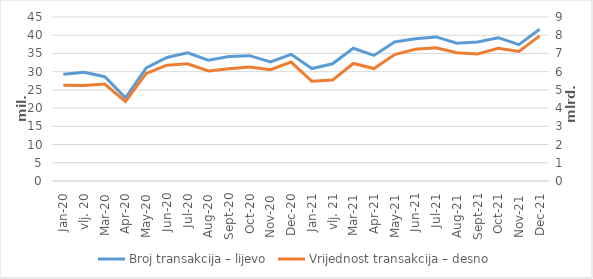
| Category | Broj transakcija – lijevo |
|---|---|
| sij.20 | 29304697 |
| vlj. 20 | 29831606 |
| ožu.20 | 28609157 |
| tra.20 | 22811373 |
| svi.20 | 31008472 |
| lip.20 | 33899579 |
| srp.20 | 35194797 |
| kol.20 | 33170654 |
| ruj.20 | 34132416 |
| lis.20 | 34392176 |
| stu.20 | 32703782 |
| pro.20 | 34752449 |
| sij.21 | 30857736 |
| vlj. 21 | 32165658 |
| ožu.21 | 36430661 |
| tra.21 | 34458263 |
| svi.21 | 38155959 |
| lip.21 | 39005206 |
| srp.21 | 39533016 |
| kol.21 | 37807123 |
| ruj.21 | 38169994 |
| lis.21 | 39326032 |
| stu.21 | 37413504 |
| pro.21 | 41620897 |